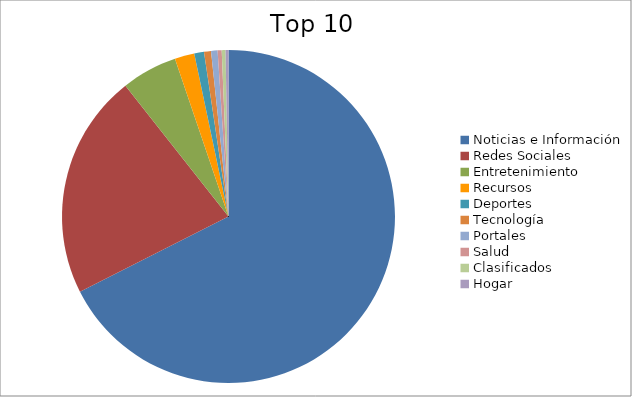
| Category | Series 0 |
|---|---|
| Noticias e Información | 66.5 |
| Redes Sociales | 21.5 |
| Entretenimiento | 5.33 |
| Recursos | 1.88 |
| Deportes | 0.93 |
| Tecnología | 0.67 |
| Portales | 0.62 |
| Salud | 0.39 |
| Clasificados | 0.36 |
| Hogar | 0.28 |